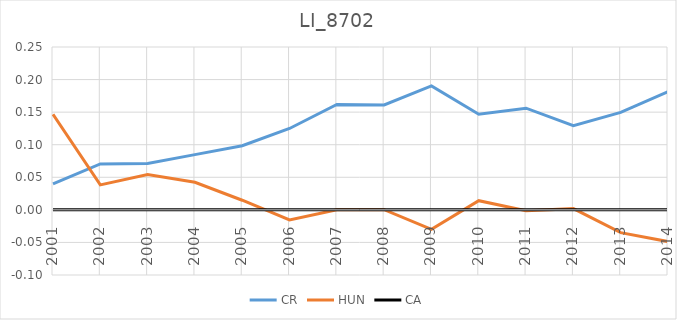
| Category | CR | HUN | CA |
|---|---|---|---|
| 2001.0 | 0.04 | 0.147 | 0 |
| 2002.0 | 0.071 | 0.038 | 0 |
| 2003.0 | 0.071 | 0.054 | 0 |
| 2004.0 | 0.085 | 0.042 | 0 |
| 2005.0 | 0.098 | 0.015 | 0 |
| 2006.0 | 0.125 | -0.016 | 0 |
| 2007.0 | 0.162 | 0 | 0 |
| 2008.0 | 0.161 | 0 | 0 |
| 2009.0 | 0.19 | -0.03 | 0 |
| 2010.0 | 0.147 | 0.014 | 0 |
| 2011.0 | 0.156 | -0.001 | 0 |
| 2012.0 | 0.129 | 0.002 | 0 |
| 2013.0 | 0.15 | -0.035 | 0 |
| 2014.0 | 0.181 | -0.049 | 0 |